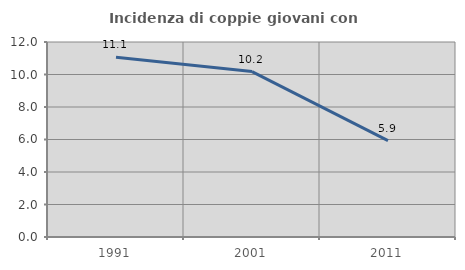
| Category | Incidenza di coppie giovani con figli |
|---|---|
| 1991.0 | 11.063 |
| 2001.0 | 10.178 |
| 2011.0 | 5.935 |